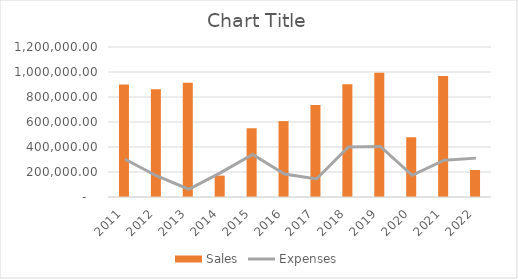
| Category | Sales |
|---|---|
| 2011.0 | 900000 |
| 2012.0 | 862000 |
| 2013.0 | 914000 |
| 2014.0 | 171000 |
| 2015.0 | 550000 |
| 2016.0 | 607000 |
| 2017.0 | 736000 |
| 2018.0 | 903000 |
| 2019.0 | 994000 |
| 2020.0 | 478000 |
| 2021.0 | 968000 |
| 2022.0 | 216000 |